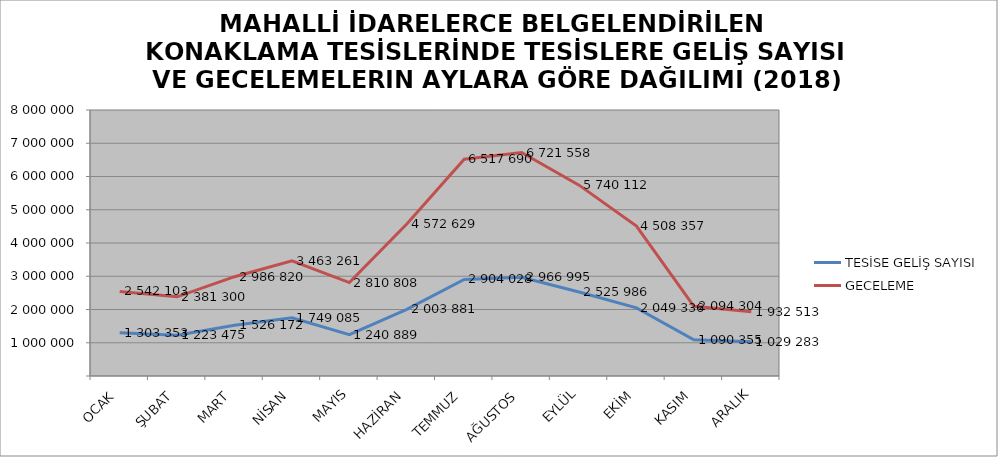
| Category | TESİSE GELİŞ SAYISI | GECELEME |
|---|---|---|
| OCAK | 1303353 | 2542103 |
| ŞUBAT | 1223475 | 2381300 |
| MART | 1526172 | 2986820 |
| NİSAN | 1749085 | 3463261 |
| MAYIS | 1240889 | 2810808 |
| HAZİRAN | 2003881 | 4572629 |
| TEMMUZ | 2904028 | 6517690 |
| AĞUSTOS | 2966995 | 6721558 |
| EYLÜL | 2525986 | 5740112 |
| EKİM | 2049336 | 4508357 |
| KASIM | 1090355 | 2094304 |
| ARALIK | 1029283 | 1932513 |